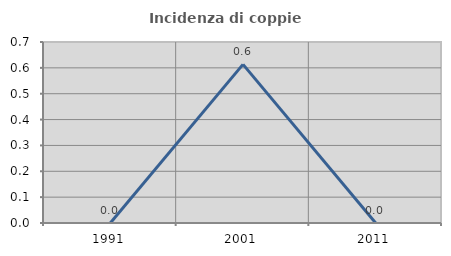
| Category | Incidenza di coppie miste |
|---|---|
| 1991.0 | 0 |
| 2001.0 | 0.613 |
| 2011.0 | 0 |